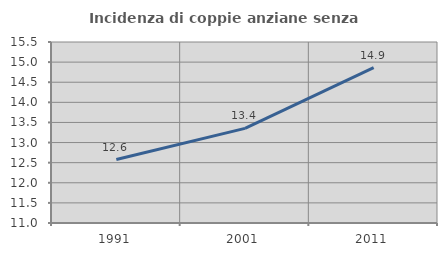
| Category | Incidenza di coppie anziane senza figli  |
|---|---|
| 1991.0 | 12.577 |
| 2001.0 | 13.353 |
| 2011.0 | 14.861 |